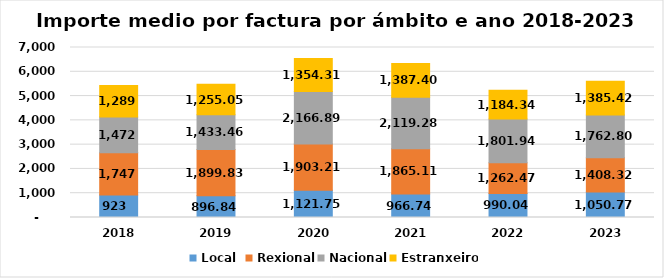
| Category | Local  | Rexional | Nacional | Estranxeiro |
|---|---|---|---|---|
| 2018.0 | 922.872 | 1746.574 | 1472.454 | 1288.617 |
| 2019.0 | 896.839 | 1899.826 | 1433.465 | 1255.048 |
| 2020.0 | 1121.752 | 1903.213 | 2166.887 | 1354.307 |
| 2021.0 | 966.74 | 1865.11 | 2119.28 | 1387.4 |
| 2022.0 | 990.041 | 1262.469 | 1801.943 | 1184.344 |
| 2023.0 | 1050.765 | 1408.324 | 1762.799 | 1385.419 |